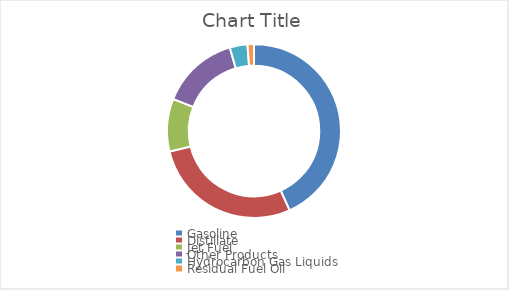
| Category | Series 0 |
|---|---|
| Gasoline | 0.433 |
| Distillate | 0.279 |
| Jet Fuel | 0.098 |
| Other Products | 0.145 |
| Hydrocarbon Gas Liquids | 0.033 |
| Residual Fuel Oil | 0.012 |